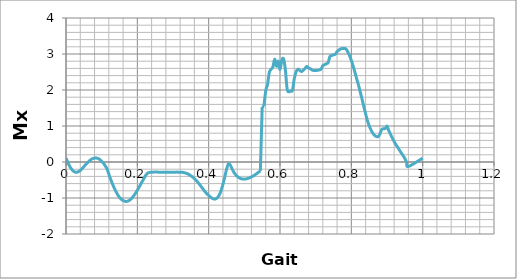
| Category | Series 0 |
|---|---|
| 0.0 | 0.108 |
| 0.005 | -0.007 |
| 0.01 | -0.114 |
| 0.015 | -0.19 |
| 0.02 | -0.248 |
| 0.025 | -0.279 |
| 0.03 | -0.285 |
| 0.035 | -0.267 |
| 0.04 | -0.234 |
| 0.045 | -0.187 |
| 0.05 | -0.129 |
| 0.055 | -0.075 |
| 0.06 | -0.022 |
| 0.065 | 0.026 |
| 0.07 | 0.066 |
| 0.075 | 0.095 |
| 0.08 | 0.109 |
| 0.085 | 0.11 |
| 0.09 | 0.097 |
| 0.095 | 0.068 |
| 0.1 | 0.015 |
| 0.105 | -0.034 |
| 0.11 | -0.108 |
| 0.115 | -0.193 |
| 0.12 | -0.335 |
| 0.125 | -0.475 |
| 0.13 | -0.6 |
| 0.135 | -0.717 |
| 0.14 | -0.821 |
| 0.145 | -0.911 |
| 0.15 | -0.983 |
| 0.155 | -1.035 |
| 0.16 | -1.069 |
| 0.165 | -1.091 |
| 0.17 | -1.095 |
| 0.175 | -1.08 |
| 0.18 | -1.047 |
| 0.185 | -0.999 |
| 0.19 | -0.938 |
| 0.195 | -0.865 |
| 0.2 | -0.784 |
| 0.205 | -0.698 |
| 0.21 | -0.608 |
| 0.215 | -0.518 |
| 0.22 | -0.431 |
| 0.225 | -0.348 |
| 0.23 | -0.304 |
| 0.235 | -0.288 |
| 0.24 | -0.284 |
| 0.245 | -0.281 |
| 0.25 | -0.281 |
| 0.255 | -0.281 |
| 0.26 | -0.282 |
| 0.265 | -0.283 |
| 0.27 | -0.284 |
| 0.275 | -0.285 |
| 0.28 | -0.287 |
| 0.285 | -0.288 |
| 0.29 | -0.287 |
| 0.295 | -0.288 |
| 0.3 | -0.287 |
| 0.305 | -0.286 |
| 0.31 | -0.28 |
| 0.315 | -0.286 |
| 0.32 | -0.285 |
| 0.325 | -0.283 |
| 0.33 | -0.293 |
| 0.335 | -0.307 |
| 0.34 | -0.323 |
| 0.345 | -0.349 |
| 0.35 | -0.382 |
| 0.355 | -0.417 |
| 0.36 | -0.461 |
| 0.365 | -0.511 |
| 0.37 | -0.568 |
| 0.375 | -0.63 |
| 0.38 | -0.695 |
| 0.385 | -0.762 |
| 0.39 | -0.825 |
| 0.395 | -0.883 |
| 0.4 | -0.931 |
| 0.405 | -0.974 |
| 0.41 | -1.011 |
| 0.415 | -1.029 |
| 0.42 | -1.024 |
| 0.425 | -0.987 |
| 0.43 | -0.911 |
| 0.435 | -0.788 |
| 0.44 | -0.621 |
| 0.445 | -0.42 |
| 0.45 | -0.21 |
| 0.455 | -0.057 |
| 0.46 | -0.075 |
| 0.465 | -0.178 |
| 0.47 | -0.276 |
| 0.475 | -0.347 |
| 0.48 | -0.398 |
| 0.485 | -0.435 |
| 0.49 | -0.46 |
| 0.495 | -0.473 |
| 0.5 | -0.476 |
| 0.505 | -0.469 |
| 0.51 | -0.455 |
| 0.515 | -0.437 |
| 0.52 | -0.414 |
| 0.525 | -0.387 |
| 0.53 | -0.356 |
| 0.535 | -0.32 |
| 0.54 | -0.283 |
| 0.545 | -0.248 |
| 0.55 | 1.526 |
| 0.555 | 1.551 |
| 0.56 | 1.981 |
| 0.565 | 2.152 |
| 0.57 | 2.486 |
| 0.575 | 2.577 |
| 0.58 | 2.637 |
| 0.585 | 2.856 |
| 0.59 | 2.661 |
| 0.595 | 2.801 |
| 0.6 | 2.57 |
| 0.605 | 2.822 |
| 0.61 | 2.866 |
| 0.615 | 2.568 |
| 0.62 | 2.027 |
| 0.625 | 1.952 |
| 0.63 | 1.974 |
| 0.635 | 1.993 |
| 0.64 | 2.313 |
| 0.645 | 2.502 |
| 0.65 | 2.576 |
| 0.655 | 2.548 |
| 0.66 | 2.512 |
| 0.665 | 2.547 |
| 0.67 | 2.593 |
| 0.675 | 2.656 |
| 0.68 | 2.61 |
| 0.685 | 2.593 |
| 0.69 | 2.555 |
| 0.695 | 2.541 |
| 0.7 | 2.54 |
| 0.705 | 2.546 |
| 0.71 | 2.559 |
| 0.715 | 2.577 |
| 0.72 | 2.677 |
| 0.725 | 2.702 |
| 0.73 | 2.73 |
| 0.735 | 2.759 |
| 0.74 | 2.932 |
| 0.745 | 2.957 |
| 0.75 | 2.978 |
| 0.755 | 2.993 |
| 0.76 | 3.066 |
| 0.765 | 3.108 |
| 0.77 | 3.14 |
| 0.775 | 3.156 |
| 0.78 | 3.151 |
| 0.785 | 3.142 |
| 0.79 | 3.061 |
| 0.795 | 2.953 |
| 0.8 | 2.822 |
| 0.805 | 2.666 |
| 0.81 | 2.492 |
| 0.815 | 2.312 |
| 0.82 | 2.14 |
| 0.825 | 1.944 |
| 0.83 | 1.749 |
| 0.835 | 1.541 |
| 0.84 | 1.341 |
| 0.845 | 1.15 |
| 0.85 | 1.009 |
| 0.855 | 0.892 |
| 0.86 | 0.802 |
| 0.865 | 0.74 |
| 0.87 | 0.708 |
| 0.875 | 0.705 |
| 0.88 | 0.775 |
| 0.885 | 0.902 |
| 0.89 | 0.926 |
| 0.895 | 0.93 |
| 0.9 | 0.997 |
| 0.905 | 0.871 |
| 0.91 | 0.767 |
| 0.915 | 0.666 |
| 0.92 | 0.571 |
| 0.925 | 0.48 |
| 0.93 | 0.408 |
| 0.935 | 0.329 |
| 0.94 | 0.25 |
| 0.945 | 0.182 |
| 0.95 | 0.099 |
| 0.955 | -0.013 |
| 0.96 | -0.125 |
| 1.0 | 0.108 |